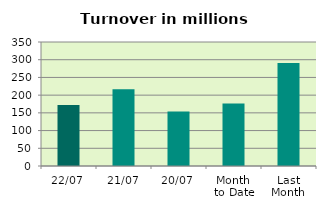
| Category | Series 0 |
|---|---|
| 22/07 | 172.445 |
| 21/07 | 216.977 |
| 20/07 | 153.806 |
| Month 
to Date | 176.321 |
| Last
Month | 290.981 |